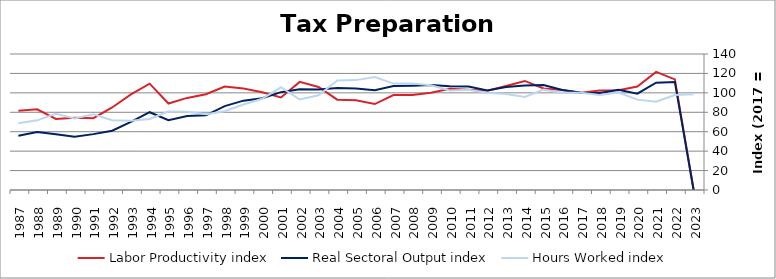
| Category | Labor Productivity index | Real Sectoral Output index | Hours Worked index |
|---|---|---|---|
| 2023.0 | 0 | 0 | 98.646 |
| 2022.0 | 113.826 | 111.258 | 97.745 |
| 2021.0 | 121.528 | 110.409 | 90.85 |
| 2020.0 | 106.573 | 99.127 | 93.014 |
| 2019.0 | 102.705 | 103.066 | 100.351 |
| 2018.0 | 102.309 | 99.963 | 97.707 |
| 2017.0 | 100 | 100 | 100 |
| 2016.0 | 102.98 | 103.011 | 100.031 |
| 2015.0 | 104.556 | 108.013 | 103.306 |
| 2014.0 | 112.279 | 107.607 | 95.839 |
| 2013.0 | 107.09 | 105.947 | 98.932 |
| 2012.0 | 102.104 | 102.326 | 100.218 |
| 2011.0 | 103.273 | 106.627 | 103.248 |
| 2010.0 | 104.251 | 106.914 | 102.554 |
| 2009.0 | 100.209 | 108.133 | 107.908 |
| 2008.0 | 97.895 | 107.362 | 109.671 |
| 2007.0 | 97.708 | 107.01 | 109.52 |
| 2006.0 | 88.478 | 102.804 | 116.192 |
| 2005.0 | 92.319 | 104.423 | 113.111 |
| 2004.0 | 93.015 | 104.889 | 112.766 |
| 2003.0 | 106.071 | 103.446 | 97.525 |
| 2002.0 | 111.273 | 103.618 | 93.121 |
| 2001.0 | 95.238 | 100.708 | 105.743 |
| 2000.0 | 100.595 | 94.483 | 93.924 |
| 1999.0 | 104.44 | 91.977 | 88.067 |
| 1998.0 | 106.506 | 86.377 | 81.101 |
| 1997.0 | 98.613 | 76.855 | 77.935 |
| 1996.0 | 94.802 | 76.247 | 80.428 |
| 1995.0 | 89.014 | 71.834 | 80.7 |
| 1994.0 | 109.488 | 80.062 | 73.124 |
| 1993.0 | 98.506 | 70.17 | 71.234 |
| 1992.0 | 84.984 | 61.07 | 71.861 |
| 1991.0 | 73.877 | 57.51 | 77.845 |
| 1990.0 | 74.417 | 54.787 | 73.623 |
| 1989.0 | 73.191 | 57.348 | 78.354 |
| 1988.0 | 83.095 | 59.583 | 71.705 |
| 1987.0 | 81.46 | 55.943 | 68.675 |